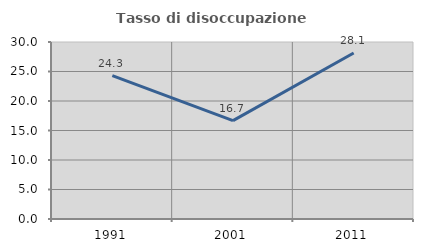
| Category | Tasso di disoccupazione giovanile  |
|---|---|
| 1991.0 | 24.317 |
| 2001.0 | 16.667 |
| 2011.0 | 28.127 |